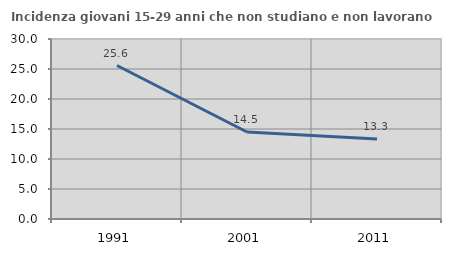
| Category | Incidenza giovani 15-29 anni che non studiano e non lavorano  |
|---|---|
| 1991.0 | 25.581 |
| 2001.0 | 14.504 |
| 2011.0 | 13.333 |